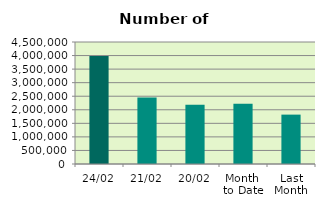
| Category | Series 0 |
|---|---|
| 24/02 | 3983066 |
| 21/02 | 2452630 |
| 20/02 | 2185698 |
| Month 
to Date | 2219187.875 |
| Last
Month | 1821445.364 |